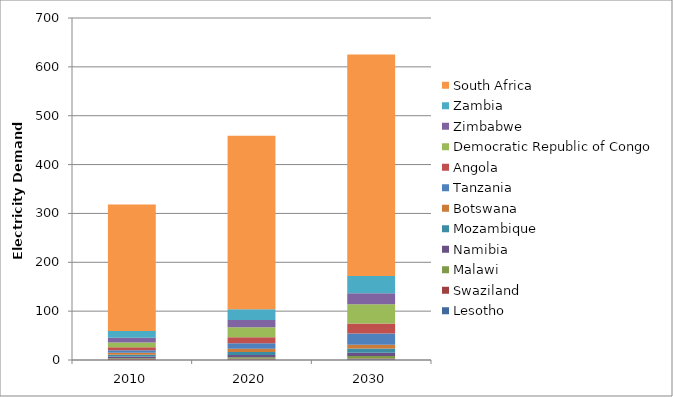
| Category | Lesotho | Swaziland | Malawi | Namibia | Mozambique | Botswana | Tanzania | Angola | Democratic Republic of Congo | Zimbabwe | Zambia | South Africa |
|---|---|---|---|---|---|---|---|---|---|---|---|---|
| 2010.0 | 0.576 | 1.262 | 1.6 | 3.648 | 3.758 | 4.202 | 4.82 | 6.343 | 9.39 | 10.142 | 13.509 | 258.87 |
| 2020.0 | 0.866 | 1.72 | 2.995 | 4.804 | 5.966 | 6.848 | 10.896 | 12.674 | 20.272 | 15.013 | 21.899 | 354.899 |
| 2030.0 | 1.309 | 1.952 | 4.879 | 6.608 | 8.84 | 7.73 | 23.09 | 20.294 | 39.492 | 22.222 | 35.671 | 453.069 |